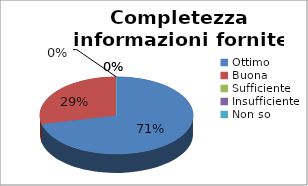
| Category | Completezza informazioni fornite |
|---|---|
| Ottimo | 15 |
| Buona | 6 |
| Sufficiente | 0 |
| Insufficiente | 0 |
| Non so | 0 |